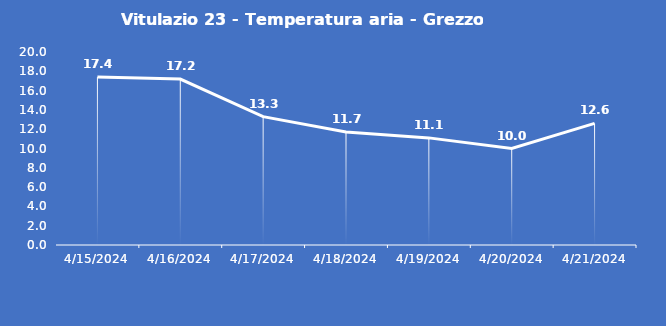
| Category | Vitulazio 23 - Temperatura aria - Grezzo (°C) |
|---|---|
| 4/15/24 | 17.4 |
| 4/16/24 | 17.2 |
| 4/17/24 | 13.3 |
| 4/18/24 | 11.7 |
| 4/19/24 | 11.1 |
| 4/20/24 | 10 |
| 4/21/24 | 12.6 |